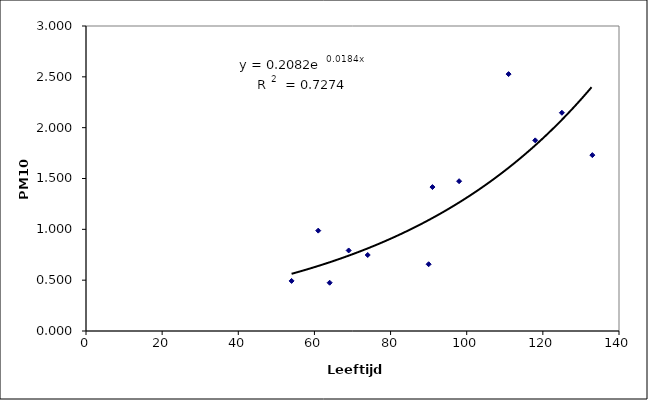
| Category | Series 0 |
|---|---|
| 54.0 | 0.493 |
| 90.0 | 0.657 |
| 64.0 | 0.475 |
| 125.0 | 2.147 |
| 61.0 | 0.987 |
| 98.0 | 1.474 |
| 69.0 | 0.792 |
| 111.0 | 2.527 |
| 91.0 | 1.416 |
| 74.0 | 0.748 |
| 118.0 | 1.875 |
| 133.0 | 1.73 |